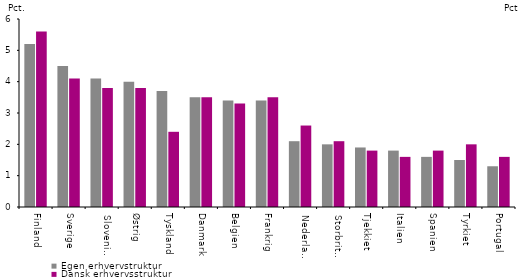
| Category | Egen erhvervstruktur | Dansk erhvervsstruktur |
|---|---|---|
| Finland | 5.2 | 5.6 |
| Sverige | 4.5 | 4.1 |
| Slovenien | 4.1 | 3.8 |
| Østrig | 4 | 3.8 |
| Tyskland | 3.7 | 2.4 |
| Danmark | 3.5 | 3.5 |
| Belgien | 3.4 | 3.3 |
| Frankrig | 3.4 | 3.5 |
| Nederlandene | 2.1 | 2.6 |
| Storbritannien | 2 | 2.1 |
| Tjekkiet | 1.9 | 1.8 |
| Italien | 1.8 | 1.6 |
| Spanien | 1.6 | 1.8 |
| Tyrkiet | 1.5 | 2 |
| Portugal | 1.3 | 1.6 |